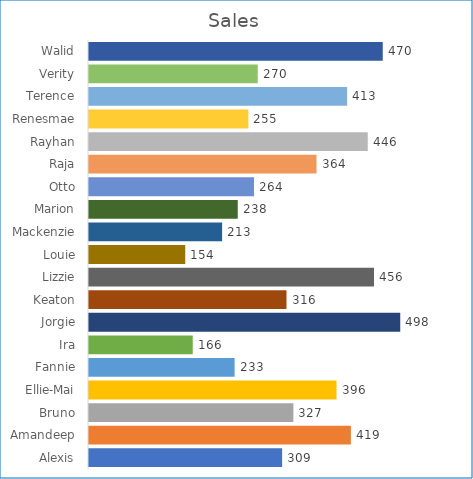
| Category | Sales |
|---|---|
| Alexis | 309 |
| Amandeep | 419 |
| Bruno | 327 |
| Ellie-Mai | 396 |
| Fannie | 233 |
| Ira | 166 |
| Jorgie | 498 |
| Keaton | 316 |
| Lizzie | 456 |
| Louie | 154 |
| Mackenzie | 213 |
| Marion | 238 |
| Otto | 264 |
| Raja | 364 |
| Rayhan | 446 |
| Renesmae | 255 |
| Terence | 413 |
| Verity | 270 |
| Walid | 470 |